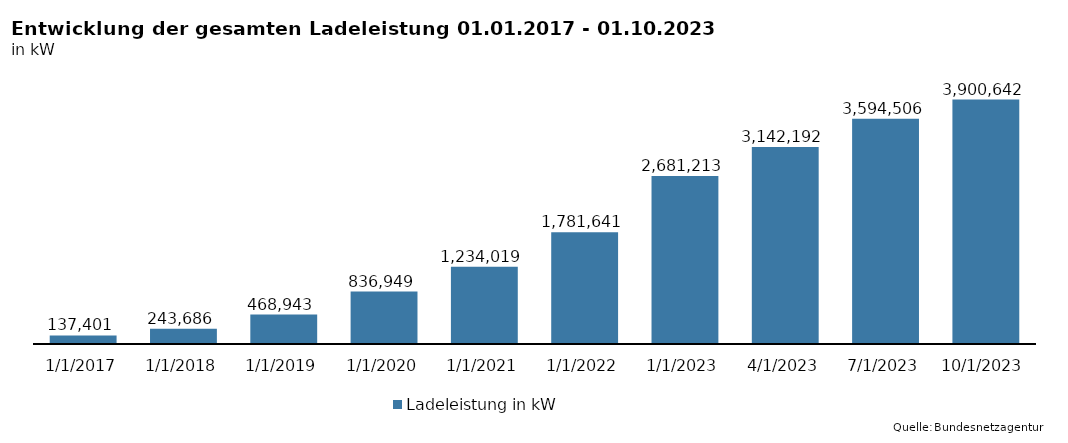
| Category | Ladeleistung in kW |
|---|---|
| 1/1/17 | 137400.7 |
| 1/1/18 | 243686.23 |
| 1/1/19 | 468943.33 |
| 1/1/20 | 836949.09 |
| 1/1/21 | 1234018.55 |
| 1/1/22 | 1781641.15 |
| 1/1/23 | 2681212.65 |
| 4/1/23 | 3142191.8 |
| 7/1/23 | 3594505.95 |
| 10/1/23 | 3900641.63 |